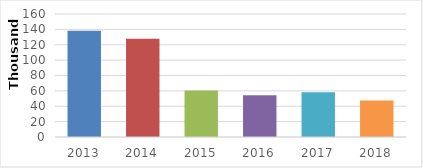
| Category | CAPACITACIÓN |
|---|---|
| 2013.0 | 138102 |
| 2014.0 | 127817 |
| 2015.0 | 60631 |
| 2016.0 | 54266 |
| 2017.0 | 58217 |
| 2018.0 | 47444 |